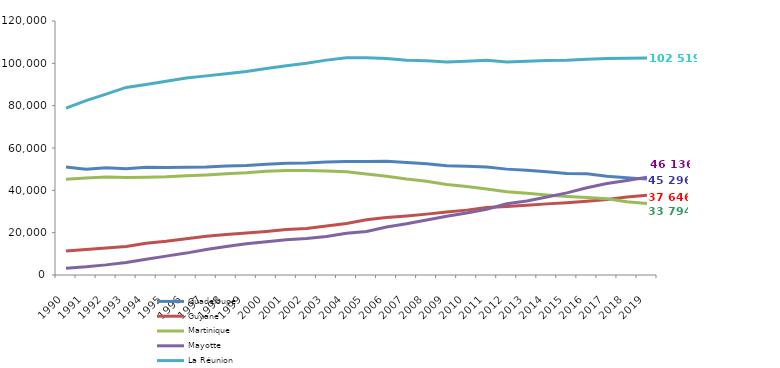
| Category | Guadeloupe | Guyane | Martinique | Mayotte | La Réunion |
|---|---|---|---|---|---|
| 1990.0 | 50994 | 11300 | 45209 | 3239 | 78851 |
| 1991.0 | 49979 | 12058 | 45776 | 3860 | 82411 |
| 1992.0 | 50693 | 12703 | 46322 | 4780 | 85467 |
| 1993.0 | 50174 | 13494 | 46108 | 5946 | 88606 |
| 1994.0 | 50906 | 15034 | 46178 | 7421 | 90045 |
| 1995.0 | 50790 | 15900 | 46383 | 8923 | 91546 |
| 1996.0 | 50878 | 17077 | 46871 | 10345 | 93019 |
| 1997.0 | 51024 | 18291 | 47253 | 12065 | 94072 |
| 1998.0 | 51505 | 19169 | 47785 | 13464 | 95132 |
| 1999.0 | 51711 | 19827 | 48264 | 14735 | 96168 |
| 2000.0 | 52285 | 20585 | 49071 | 15686 | 97550 |
| 2001.0 | 52788 | 21439 | 49415 | 16610 | 98848 |
| 2002.0 | 52926 | 22003 | 49426 | 17258 | 100020 |
| 2003.0 | 53374 | 23198 | 49082 | 18177 | 101522 |
| 2004.0 | 53672 | 24345 | 48729 | 19712 | 102592 |
| 2005.0 | 53668 | 26091 | 47683 | 20600 | 102613 |
| 2006.0 | 53787 | 27190 | 46700 | 22657 | 102233 |
| 2007.0 | 53168 | 27930 | 45348 | 24180 | 101480 |
| 2008.0 | 52547 | 28758 | 44277 | 26006 | 101262 |
| 2009.0 | 51580 | 29750 | 42740 | 27798 | 100635 |
| 2010.0 | 51331 | 30648 | 41785 | 29254 | 100995 |
| 2011.0 | 51010 | 31904 | 40673 | 31094 | 101457 |
| 2012.0 | 50019 | 32371 | 39362 | 33646 | 100611 |
| 2013.0 | 49491 | 32966 | 38615 | 34996 | 101015 |
| 2014.0 | 48797 | 33603 | 37765 | 36830 | 101338 |
| 2015.0 | 47969 | 34154 | 37120 | 38795 | 101504 |
| 2016.0 | 47777 | 34848 | 36640 | 41244 | 101983 |
| 2017.0 | 46709 | 35714 | 36000 | 43229 | 102292 |
| 2018.0 | 45995 | 36810 | 34606 | 44633 | 102390 |
| 2019.0 | 45296 | 37646 | 33794 | 46136 | 102519 |